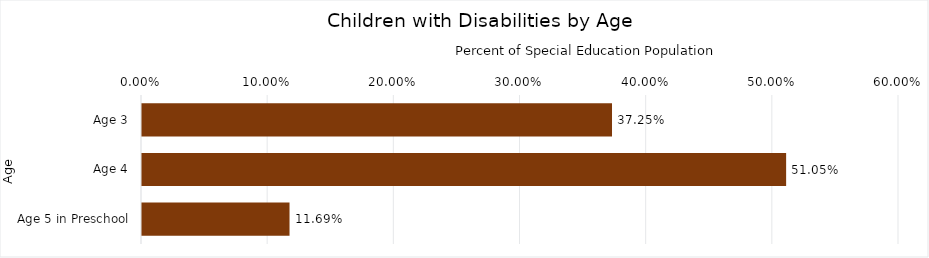
| Category | Percentage |
|---|---|
| Age 3 | 0.373 |
| Age 4 | 0.511 |
| Age 5 in Preschool | 0.117 |